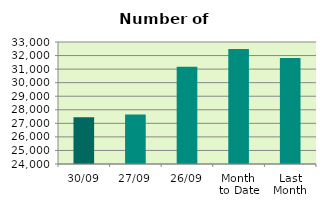
| Category | Series 0 |
|---|---|
| 30/09 | 27446 |
| 27/09 | 27650 |
| 26/09 | 31180 |
| Month 
to Date | 32492.381 |
| Last
Month | 31813.182 |